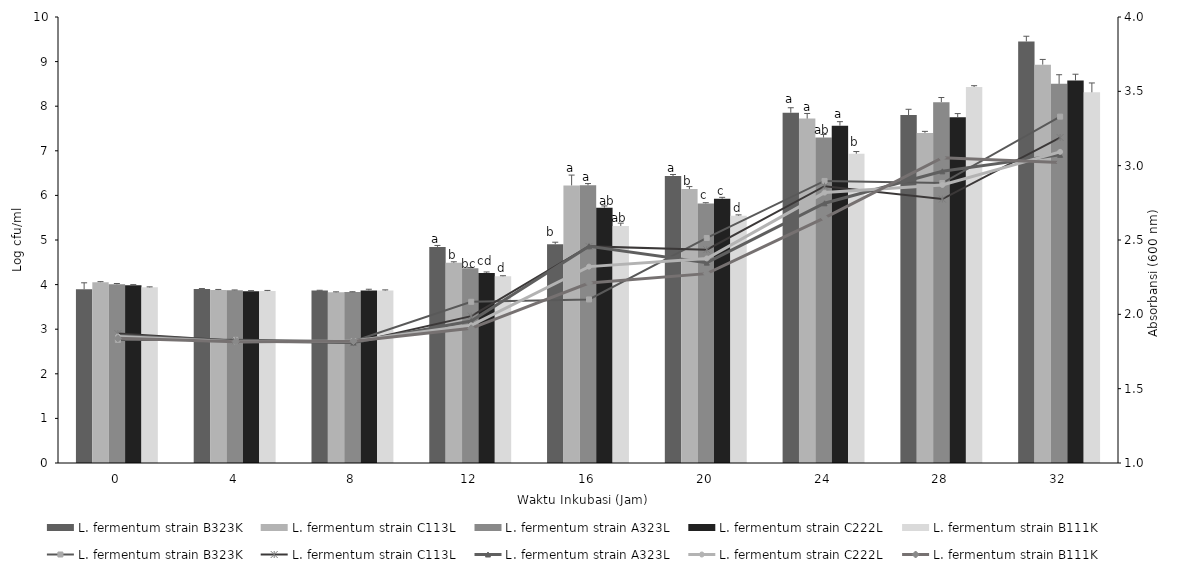
| Category | L. fermentum strain B323K | L. fermentum strain C113L | L. fermentum strain A323L | L. fermentum strain C222L | L. fermentum strain B111K |
|---|---|---|---|---|---|
| 0.0 | 3.896 | 4.055 | 4.007 | 3.985 | 3.938 |
| 4.0 | 3.899 | 3.877 | 3.873 | 3.849 | 3.854 |
| 8.0 | 3.865 | 3.827 | 3.832 | 3.869 | 3.867 |
| 12.0 | 4.846 | 4.49 | 4.368 | 4.262 | 4.186 |
| 16.0 | 4.905 | 6.224 | 6.226 | 5.721 | 5.314 |
| 20.0 | 6.434 | 6.141 | 5.82 | 5.924 | 5.546 |
| 24.0 | 7.852 | 7.722 | 7.297 | 7.562 | 6.935 |
| 28.0 | 7.8 | 7.401 | 8.091 | 7.752 | 8.431 |
| 32.0 | 9.452 | 8.932 | 8.501 | 8.575 | 8.312 |